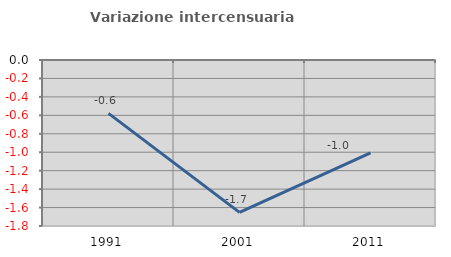
| Category | Variazione intercensuaria annua |
|---|---|
| 1991.0 | -0.579 |
| 2001.0 | -1.653 |
| 2011.0 | -1.006 |